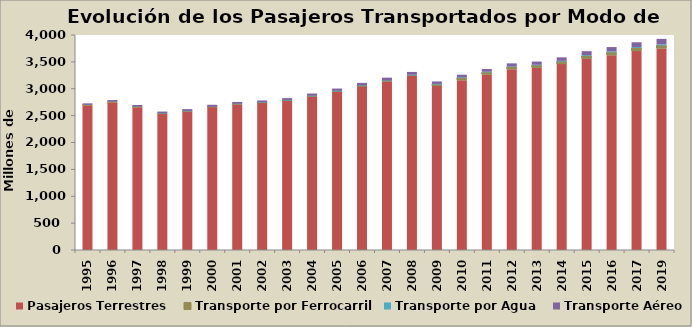
| Category | Pasajeros Terrestres | Transporte por Ferrocarril | Transporte por Agua | Transporte Aéreo |
|---|---|---|---|---|
| 1995.0 | 2691 | 6.678 | 5.098 | 25.192 |
| 1996.0 | 2750 | 6.727 | 6.394 | 26.493 |
| 1997.0 | 2658 | 5.092 | 6.228 | 28.896 |
| 1998.0 | 2536 | 1.576 | 7.179 | 30.922 |
| 1999.0 | 2580 | 0.801 | 7.854 | 32.662 |
| 2000.0 | 2660 | 0.334 | 7.4 | 33.974 |
| 2001.0 | 2713 | 0.242 | 7.507 | 33.673 |
| 2002.0 | 2740 | 0.237 | 8.715 | 33.19 |
| 2003.0 | 2780 | 0.27 | 9.843 | 35.287 |
| 2004.0 | 2860 | 0.253 | 11.744 | 39.422 |
| 2005.0 | 2950 | 0.253 | 11.461 | 42.176 |
| 2006.0 | 3050 | 0.26 | 11.985 | 46.705 |
| 2007.0 | 3141 | 0.288 | 12.761 | 52.217 |
| 2008.0 | 3238 | 8.915 | 12.597 | 53.3 |
| 2009.0 | 3050 | 28 | 10.985 | 46.971 |
| 2010.0 | 3160 | 40.398 | 11.793 | 48.698 |
| 2011.0 | 3264.3 | 41.922 | 10.814 | 50.764 |
| 2012.0 | 3363 | 43.83 | 10.268 | 55.153 |
| 2013.0 | 3391 | 45.288 | 9.969 | 60.007 |
| 2014.0 | 3459 | 47.888 | 11.948 | 65.135 |
| 2015.0 | 3558 | 53.594 | 13.685 | 73.265 |
| 2016.0 | 3623 | 55.766 | 15.272 | 81.286 |
| 2017.0 | 3701 | 56.715 | 17.429 | 89.641 |
| 2019.0 | 3749 | 57.511 | 19.929 | 101.389 |